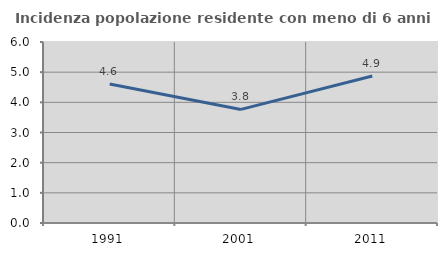
| Category | Incidenza popolazione residente con meno di 6 anni |
|---|---|
| 1991.0 | 4.605 |
| 2001.0 | 3.765 |
| 2011.0 | 4.871 |